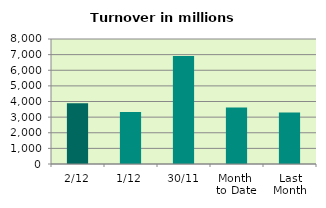
| Category | Series 0 |
|---|---|
| 2/12 | 3889.618 |
| 1/12 | 3328.986 |
| 30/11 | 6909.705 |
| Month 
to Date | 3609.302 |
| Last
Month | 3292.145 |